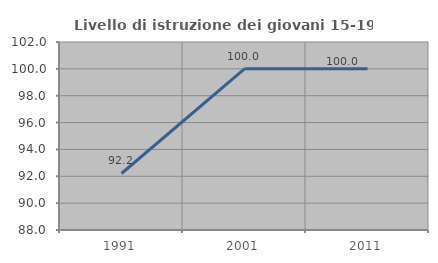
| Category | Livello di istruzione dei giovani 15-19 anni |
|---|---|
| 1991.0 | 92.208 |
| 2001.0 | 100 |
| 2011.0 | 100 |